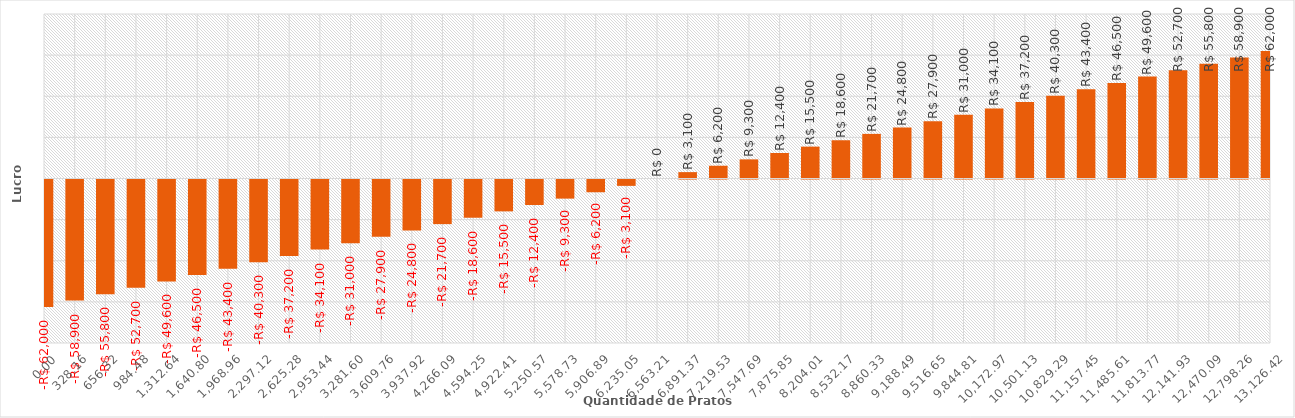
| Category | Lucro |
|---|---|
| 0.0 | -62000 |
| 328.16039378338803 | -58900 |
| 656.3207875667761 | -55800 |
| 984.4811813501642 | -52700 |
| 1312.6415751335521 | -49600 |
| 1640.80196891694 | -46500 |
| 1968.962362700328 | -43400 |
| 2297.122756483716 | -40300 |
| 2625.283150267104 | -37200 |
| 2953.4435440504917 | -34100 |
| 3281.6039378338796 | -31000 |
| 3609.7643316172675 | -27900 |
| 3937.924725400656 | -24800 |
| 4266.085119184044 | -21700 |
| 4594.245512967433 | -18600 |
| 4922.405906750821 | -15500 |
| 5250.566300534209 | -12400 |
| 5578.726694317597 | -9300 |
| 5906.887088100986 | -6200 |
| 6235.047481884374 | -3100 |
| 6563.207875667762 | 0 |
| 6891.36826945115 | 3100 |
| 7219.528663234538 | 6200 |
| 7547.689057017927 | 9300 |
| 7875.849450801315 | 12400 |
| 8204.009844584703 | 15500 |
| 8532.170238368091 | 18600 |
| 8860.33063215148 | 21700 |
| 9188.491025934867 | 24800 |
| 9516.651419718257 | 27900 |
| 9844.811813501645 | 31000 |
| 10172.972207285033 | 34100 |
| 10501.13260106842 | 37200 |
| 10829.29299485181 | 40300 |
| 11157.453388635198 | 43400 |
| 11485.613782418586 | 46500 |
| 11813.774176201974 | 49600 |
| 12141.934569985362 | 52700 |
| 12470.094963768752 | 55800 |
| 12798.25535755214 | 58900 |
| 13126.415751335526 | 62000 |